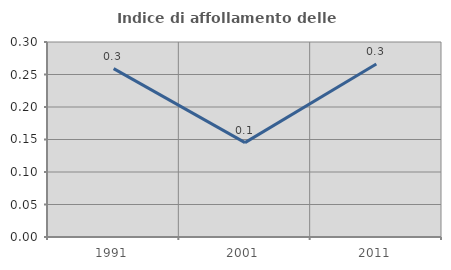
| Category | Indice di affollamento delle abitazioni  |
|---|---|
| 1991.0 | 0.259 |
| 2001.0 | 0.145 |
| 2011.0 | 0.266 |